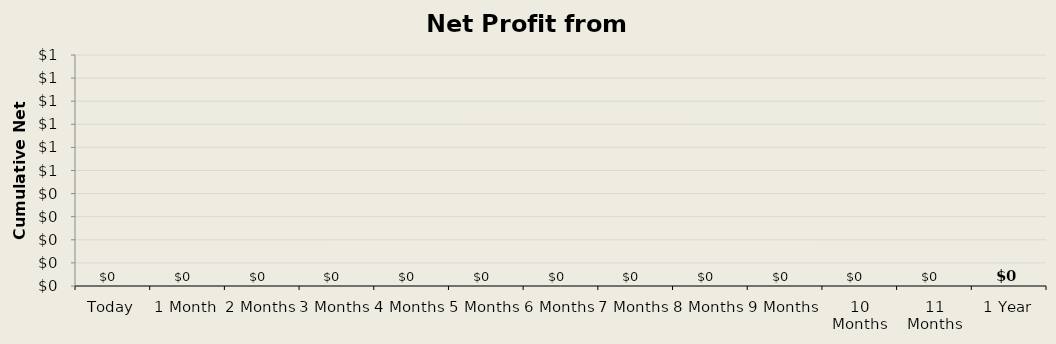
| Category | Net Training Earnings |
|---|---|
| Today | 0 |
| 1 Month | 0 |
| 2 Months | 0 |
| 3 Months | 0 |
| 4 Months | 0 |
| 5 Months | 0 |
| 6 Months | 0 |
| 7 Months | 0 |
| 8 Months | 0 |
| 9 Months | 0 |
| 10 Months | 0 |
| 11 Months | 0 |
| 1 Year | 0 |